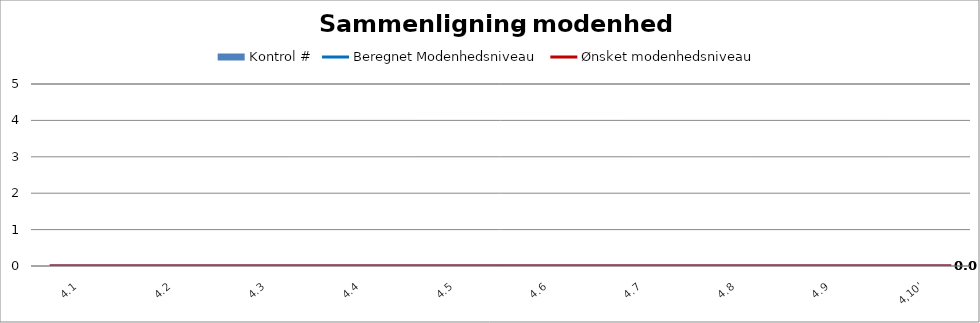
| Category | Kontrol # |
|---|---|
| 4,1 | 0 |
| 4,2 | 0 |
| 4,3 | 0 |
| 4,4 | 0 |
| 4,5 | 0 |
| 4,6 | 0 |
| 4,7 | 0 |
| 4,8 | 0 |
| 4,9 | 0 |
| 4,10' | 0 |